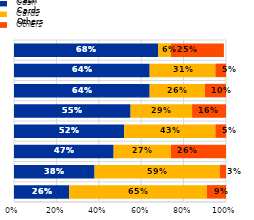
| Category | Cash | Cards | Others |
|---|---|---|---|
| Shop selling durable goods  | 0.26 | 0.65 | 0.09 |
| Petrol station | 0.38 | 0.59 | 0.03 |
| Other physical location | 0.47 | 0.27 | 0.26 |
| Local shop for day-to-day retail items and pharmacy | 0.52 | 0.43 | 0.05 |
| Venue for culture, sport or entertainment  | 0.55 | 0.29 | 0.16 |
| Vending or ticketing machine  | 0.64 | 0.26 | 0.1 |
| Restaurant, bar or café and hotel or accommodation | 0.64 | 0.31 | 0.05 |
| Charity and other P2P payments  | 0.68 | 0.06 | 0.25 |